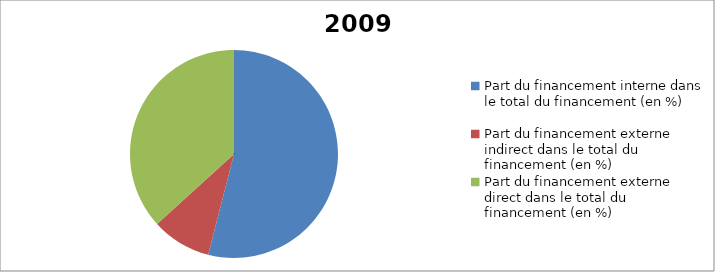
| Category | 2009 |
|---|---|
| Part du financement interne dans le total du financement (en %) | 53.994 |
| Part du financement externe indirect dans le total du financement (en %) | 9.265 |
| Part du financement externe direct dans le total du financement (en %) | 36.741 |